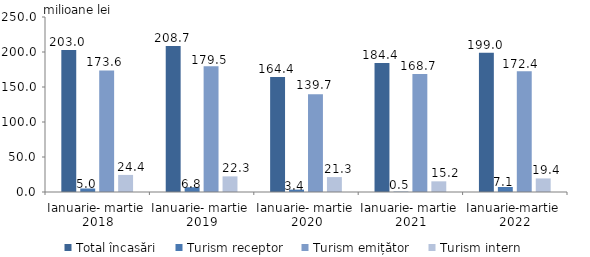
| Category | Total încasări | Turism receptor | Turism emițător | Turism intern |
|---|---|---|---|---|
| Ianuarie- martie  2018 | 203 | 5 | 173.6 | 24.4 |
| Ianuarie- martie  2019 | 208.66 | 6.82 | 179.514 | 22.325 |
| Ianuarie- martie  2020 | 164.4 | 3.4 | 139.7 | 21.3 |
| Ianuarie- martie  2021 | 184.382 | 0.486 | 168.658 | 15.238 |
| Ianuarie-martie  2022 | 199 | 7.13 | 172.43 | 19.4 |